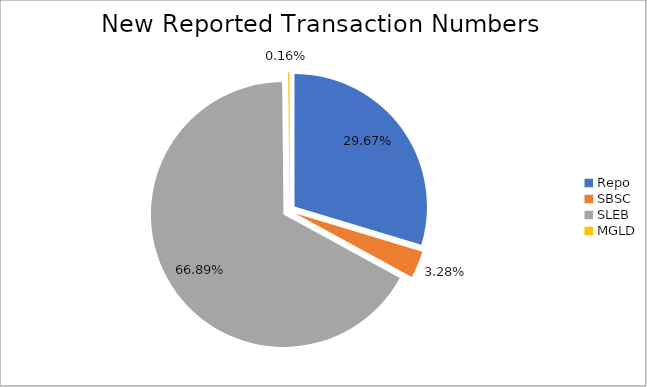
| Category | Series 0 |
|---|---|
| Repo | 413673 |
| SBSC | 45708 |
| SLEB | 932499 |
| MGLD | 2287 |